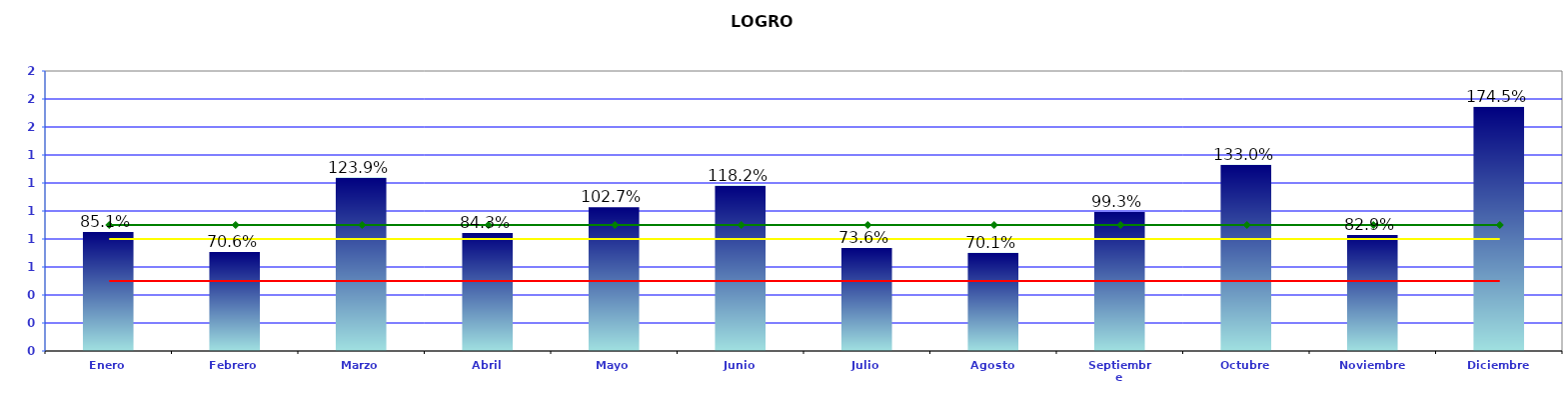
| Category | LOGROS |
|---|---|
| Enero | 0.851 |
| Febrero | 0.706 |
| Marzo | 1.239 |
| Abril | 0.843 |
| Mayo | 1.027 |
| Junio | 1.182 |
| Julio | 0.736 |
| Agosto | 0.701 |
| Septiembre | 0.993 |
| Octubre | 1.33 |
| Noviembre | 0.829 |
| Diciembre | 1.745 |